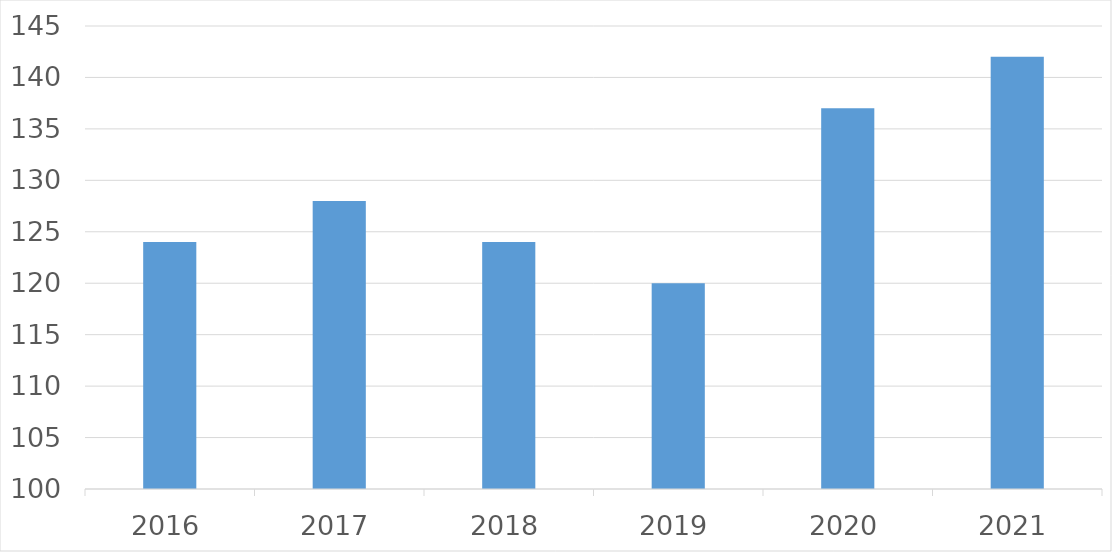
| Category | Series 0 |
|---|---|
| 2016 | 124 |
| 2017 | 128 |
| 2018 | 124 |
| 2019 | 120 |
| 2020 | 137 |
| 2021 | 142 |